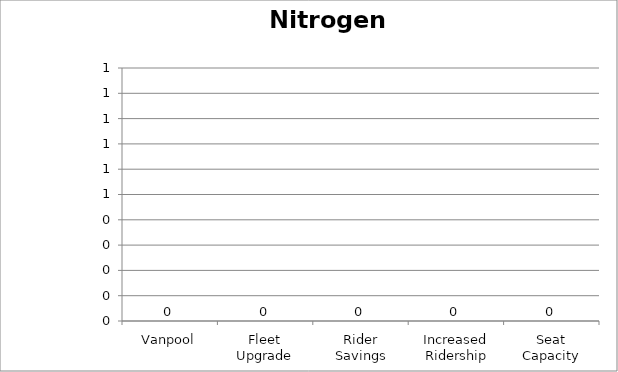
| Category | Nitrogen Oxides |
|---|---|
| Vanpool | 0 |
| Fleet Upgrade | 0 |
| Rider Savings | 0 |
| Increased Ridership | 0 |
| Seat Capacity | 0 |